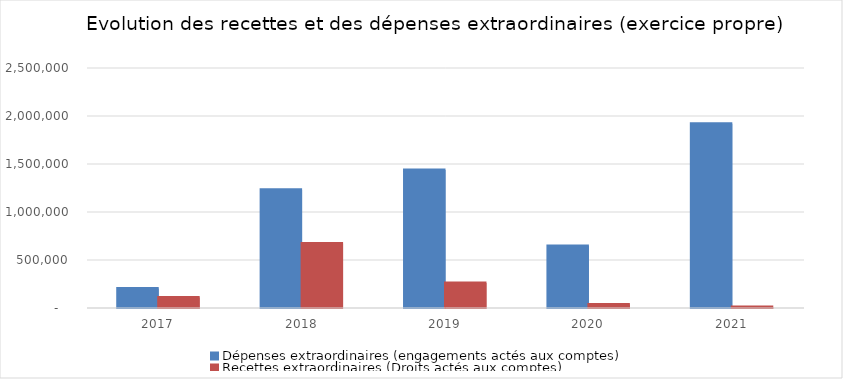
| Category | Dépenses extraordinaires (engagements actés aux comptes) | Recettes extraordinaires (Droits actés aux comptes) |
|---|---|---|
| 2017.0 | 202009.99 | 108710 |
| 2018.0 | 1231849.64 | 672785.39 |
| 2019.0 | 1438665.13 | 261205.39 |
| 2020.0 | 646216.87 | 35425.23 |
| 2021.0 | 1918340.02 | 10471.36 |